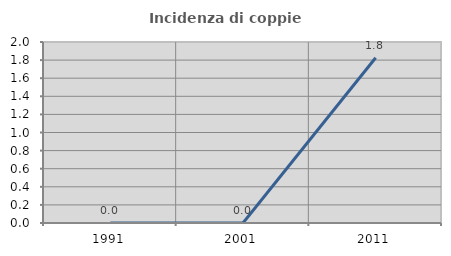
| Category | Incidenza di coppie miste |
|---|---|
| 1991.0 | 0 |
| 2001.0 | 0 |
| 2011.0 | 1.826 |